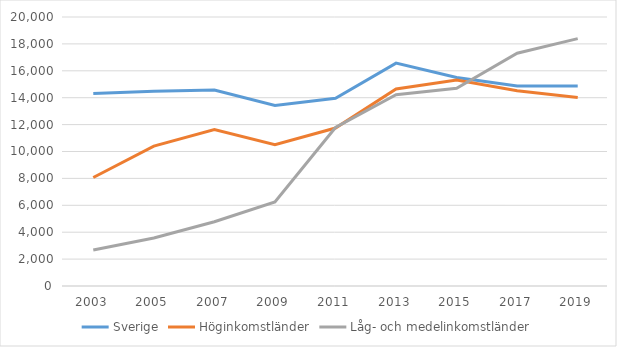
| Category | Sverige | Höginkomstländer | Låg- och medelinkomstländer |
|---|---|---|---|
| 2003.0 | 14312 | 8069 | 2680 |
| 2005.0 | 14480 | 10403.15 | 3573 |
| 2007.0 | 14574.5 | 11632.2 | 4780.6 |
| 2009.0 | 13418 | 10504 | 6250 |
| 2011.0 | 13964 | 11745 | 11781 |
| 2013.0 | 16573 | 14647 | 14222 |
| 2015.0 | 15502 | 15321 | 14701 |
| 2017.0 | 14877 | 14521 | 17310 |
| 2019.0 | 14865 | 14019 | 18390 |